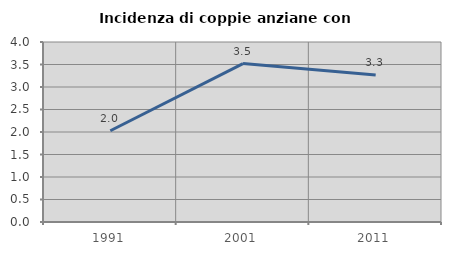
| Category | Incidenza di coppie anziane con figli |
|---|---|
| 1991.0 | 2.027 |
| 2001.0 | 3.521 |
| 2011.0 | 3.268 |